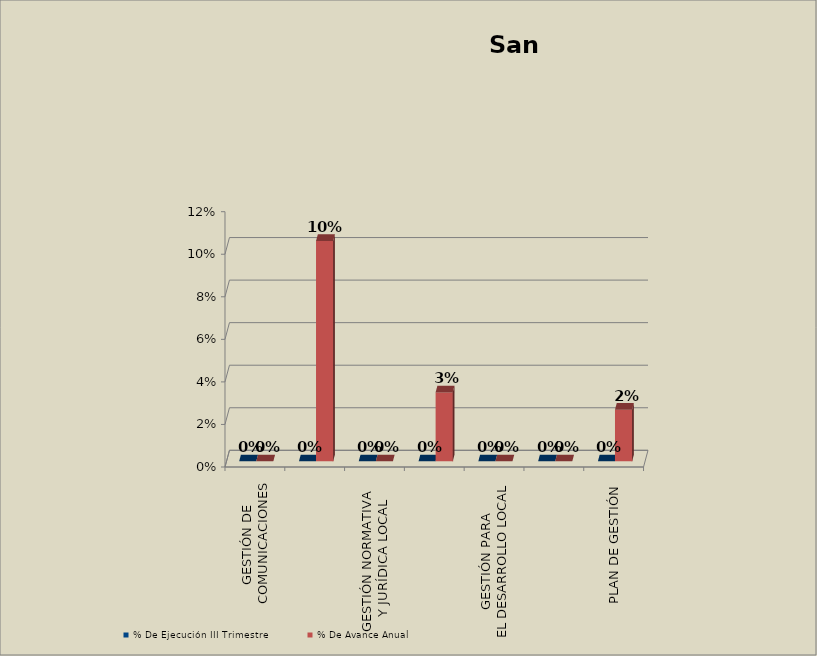
| Category | % De Ejecución III Trimestre | % De Avance Anual |
|---|---|---|
| GESTIÓN DE 
COMUNICACIONES | 0 | 0 |
| GESTIÓN Y ADQUISICIÓN
 DE RECURSOS | 0 | 0.104 |
| GESTIÓN NORMATIVA 
Y JURÍDICA LOCAL | 0 | 0 |
| GESTIÓN PARA LA
CONVIVENCIA Y SEGURIDAD
INTEGRAL | 0 | 0.032 |
| GESTIÓN PARA 
EL DESARROLLO LOCAL | 0 | 0 |
| AGENCIAMIENTO DE LA 
POLÍTICA PÚBLICA | 0 | 0 |
| PLAN DE GESTIÓN | 0 | 0.024 |